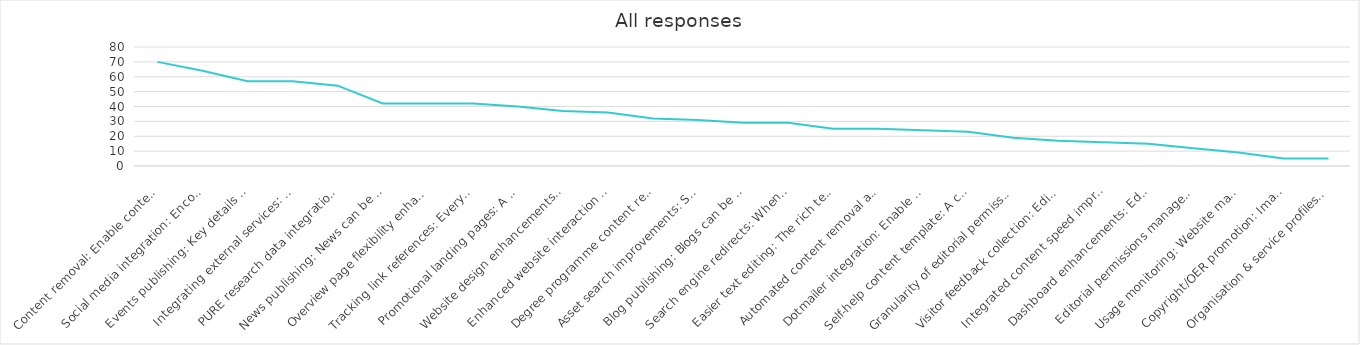
| Category | Series 0 |
|---|---|
| Content removal: Enable content that is no longer required or created in error to be removable, reducing unnecessary clutter in the EdWeb content tree for editors. | 70 |
| Social media integration: Encourage sharing of website content via social media buttons, and features to monitor engagement on popular networks. | 64 |
| Events publishing: Key details about events can be displayed differently in different contexts, such as the automatic creation of an events calendar. | 57 |
| Integrating external services: Easier integration of services such as Google Maps, You Tube videos, Twitter feeds. Simple URL pasting into EdWeb with no need for interaction with HTML or assets. | 57 |
| PURE research data integrations: Introduce more opportunities to present information from the Edinburgh Research Explorer in EdWeb-managed web pages, with no technical knowledge needed. (Currently only publication lists possible). | 54 |
| News publishing: News can be published using a dedicated content type (template); enhancing presentation on different device sizes, allowing more intelligent sharing and promotion in search results. | 42 |
| Overview page flexibility enhancements: Introduce new layout options to enable overview pages to dynamically present the content below in a range of ways. | 42 |
| Tracking link references: Every page will contain a list of all other EdWeb pages that link to it, so that when it is edited, moved or removed the editor is aware of the impact of their actions on other publishers across the University. | 42 |
| Promotional landing pages: A new page type designed for promotional impact and flexibility, which can be used at any point in a site structure. It will work much like a Generic Content page, but have presentational features similar to a homepage. | 40 |
| Website design enhancements: Evolution of design to improve website visitor experience on small devices, bringing greater focus to content over brand & navigation elements and promoting clearer/easier interactions. | 37 |
| Enhanced website interaction monitoring: Enable use of analytics tools (click heat tracking, A/B testing etc) that provide additional insight into how website visitors are interacting with the website. This informs ongoing content & design improvements. | 36 |
| Degree programme content reuse: A means to re-use and extend golden copy content about degree programmes, that is currently published only via the Degree Finder | 32 |
| Asset search improvements: Searching for images, documents, videos, content snippets etc is quicker, easier and more efficient. | 31 |
| Blog publishing: Blogs can be published via EdWeb, with sufficient design changes to distinguish from corporate web content, and new navigation and filtering options typically associated with this kind of content (sort by author, by date, by tag etc). | 29 |
| Search engine redirects: When content is moved or removed, enable 301 redirects. This reduces the risk of a website visitor receiving a 'Page not found' error from a search result in the period before the site is re-indexed. | 29 |
| Easier text editing: The rich text editor is improved, so that it's quicker and easier to make changes to content, to apply stand-out formatting elements and to ensure everything is standards compliant. | 25 |
| Automated content removal and archiving: Schedule archiving and permanent removal of unpublished content after given periods to reduce unnecessary clutter and support compliance with records management legislation. | 25 |
| Dotmailer integration: Enable use of Dotmailer through EdWeb as a means to build and manage mailing lists more efficiently. | 24 |
| Self-help content template: A content type (template) optimised for presentation of online help and guidance, supporting user self service. | 23 |
| Granularity of editorial permissions: Editing rights can be restricted to particular subsections or content types, rather than having access to everything in a particular site. | 19 |
| Visitor feedback collection: Editors can collect and view visitor ratings for page content, to identify strengths and quickly correct any errors. | 17 |
| Integrated content speed improvements: Speed up page load times for content being delivered from external systems through EdWeb. | 16 |
| Dashboard enhancements: EdWeb dashboard is more useful to editors and publishers, speeding up completion of the most common tasks, and can be configured to suit an individual's priorities. | 15 |
| Editorial permissions management: Lead publishers can assign editorial rights on their website to any trained user, without involving EdWeb support. | 12 |
| Usage monitoring: Website managers and EdWeb support services have access to data on editorial and publishing activity, which will support better website management, staffing and user support-related decision making. | 9 |
| Copyright/OER promotion: Images, documents and other assets can be promoted as Open Educational Resources, encouraging reuse of University materials worldwide. | 5 |
| Organisation & service profiles: Profiles can be published using a dedicated content type (template); enhancing presentation on different device sizes, allowing more intelligent sharing and promotion in search results. | 5 |